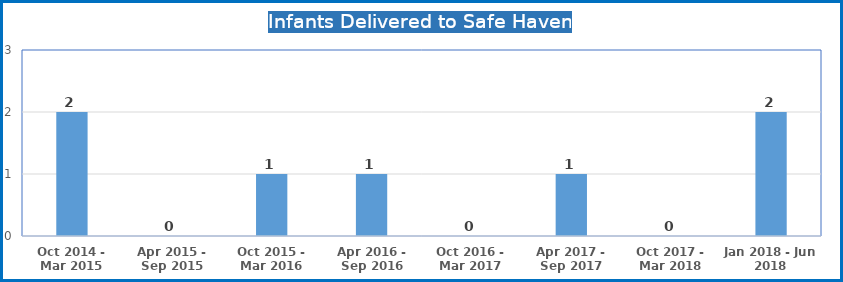
| Category | Infants Delivered to Safe Haven |
|---|---|
| Oct 2014 - Mar 2015 | 2 |
| Apr 2015 - Sep 2015 | 0 |
| Oct 2015 - Mar 2016 | 1 |
| Apr 2016 - Sep 2016 | 1 |
| Oct 2016 - Mar 2017 | 0 |
| Apr 2017 - Sep 2017 | 1 |
| Oct 2017 - Mar 2018 | 0 |
| Jan 2018 - Jun 2018 | 2 |